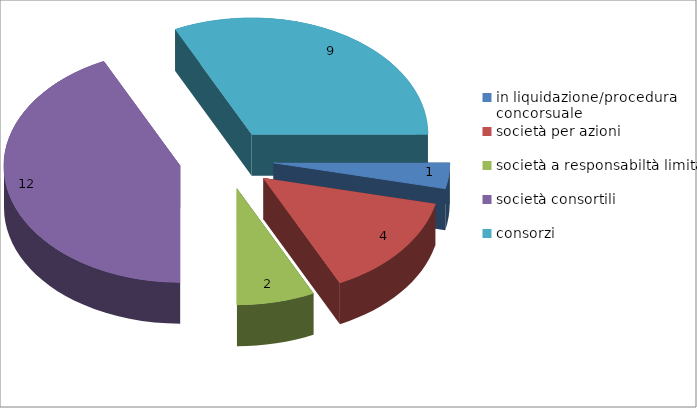
| Category | Series 0 |
|---|---|
| in liquidazione/procedura concorsuale | 1 |
| società per azioni | 4 |
| società a responsabiltà limitata | 2 |
| società consortili  | 12 |
| consorzi | 9 |